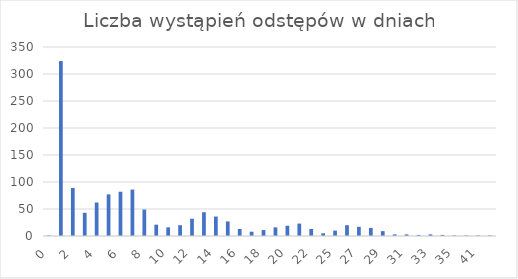
| Category | Liczba wystąpień |
|---|---|
| 0.0 | 1 |
| 1.0 | 324 |
| 2.0 | 89 |
| 3.0 | 43 |
| 4.0 | 62 |
| 5.0 | 77 |
| 6.0 | 82 |
| 7.0 | 86 |
| 8.0 | 49 |
| 9.0 | 21 |
| 10.0 | 16 |
| 11.0 | 20 |
| 12.0 | 32 |
| 13.0 | 44 |
| 14.0 | 36 |
| 15.0 | 27 |
| 16.0 | 13 |
| 17.0 | 8 |
| 18.0 | 11 |
| 19.0 | 16 |
| 20.0 | 19 |
| 21.0 | 23 |
| 22.0 | 13 |
| 23.0 | 5 |
| 25.0 | 10 |
| 26.0 | 20 |
| 27.0 | 17 |
| 28.0 | 15 |
| 29.0 | 9 |
| 30.0 | 3 |
| 31.0 | 3 |
| 32.0 | 2 |
| 33.0 | 3 |
| 34.0 | 2 |
| 35.0 | 1 |
| 36.0 | 1 |
| 41.0 | 1 |
| 42.0 | 1 |